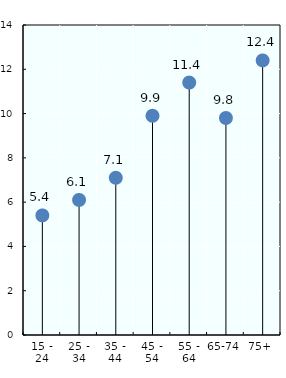
| Category | Women |
|---|---|
| 15 - 24 | 5.4 |
| 25 - 34 | 6.1 |
| 35 - 44 | 7.1 |
| 45 - 54 | 9.9 |
| 55 - 64 | 11.4 |
| 65-74 | 9.8 |
| 75+ | 12.4 |